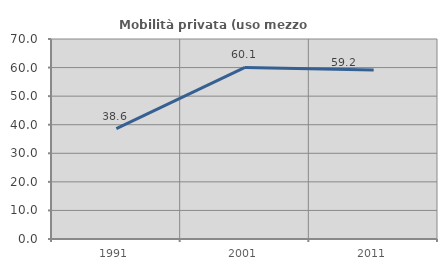
| Category | Mobilità privata (uso mezzo privato) |
|---|---|
| 1991.0 | 38.636 |
| 2001.0 | 60.068 |
| 2011.0 | 59.177 |